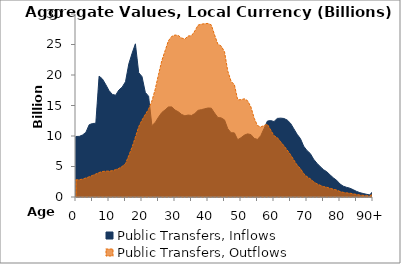
| Category | Public Transfers, Inflows | Public Transfers, Outflows |
|---|---|---|
| 0 | 9920.668 | 2805.339 |
|  | 9938.777 | 2839.822 |
| 2 | 10172.225 | 2936.855 |
| 3 | 10601.365 | 3119.667 |
| 4 | 11849.943 | 3311.089 |
| 5 | 12048.156 | 3537.58 |
| 6 | 12083.906 | 3767.925 |
| 7 | 19814.44 | 4009.179 |
| 8 | 19356.518 | 4180.906 |
| 9 | 18446.782 | 4237.292 |
| 10 | 17447.208 | 4242.71 |
| 11 | 16826.302 | 4310.795 |
| 12 | 16684.255 | 4481.475 |
| 13 | 17539.858 | 4687.702 |
| 14 | 18016.071 | 5019.883 |
| 15 | 18900.366 | 5475.433 |
| 16 | 21809.185 | 6802.804 |
| 17 | 23570.135 | 8172.753 |
| 18 | 25111.389 | 9823.642 |
| 19 | 20380.881 | 11507.075 |
| 20 | 19734.785 | 12611.187 |
| 21 | 17159.165 | 13526.571 |
| 22 | 16506.856 | 14407.683 |
| 23 | 11700.83 | 15741.328 |
| 24 | 12200.439 | 17652.788 |
| 25 | 13087.684 | 20076.02 |
| 26 | 13848.914 | 22343.268 |
| 27 | 14277.727 | 23980.216 |
| 28 | 14761.108 | 25607.101 |
| 29 | 14773.37 | 26327.474 |
| 30 | 14254.788 | 26554.765 |
| 31 | 13971.047 | 26480.08 |
| 32 | 13533.872 | 26057.144 |
| 33 | 13310.927 | 25909.313 |
| 34 | 13435.345 | 26395.416 |
| 35 | 13365.019 | 26444.422 |
| 36 | 13682.045 | 27208.693 |
| 37 | 14206.637 | 28178.239 |
| 38 | 14317.797 | 28339.223 |
| 39 | 14460.916 | 28408.526 |
| 40 | 14588.614 | 28454.356 |
| 41 | 14561.138 | 28212.584 |
| 42 | 13751.503 | 26560.089 |
| 43 | 13022.239 | 25056.15 |
| 44 | 12967.369 | 24748.433 |
| 45 | 12633.656 | 23812.054 |
| 46 | 11181.794 | 20634.886 |
| 47 | 10532.785 | 18965.276 |
| 48 | 10508.145 | 18396.964 |
| 49 | 9391.481 | 15931.026 |
| 50 | 9715.049 | 15954.748 |
| 51 | 10137.777 | 16102.619 |
| 52 | 10351.35 | 15779.111 |
| 53 | 10228.866 | 14776.665 |
| 54 | 9613.046 | 12921.587 |
| 55 | 9434.893 | 11705.814 |
| 56 | 10059.739 | 11483.534 |
| 57 | 11239.312 | 11732.735 |
| 58 | 12453.292 | 11912.003 |
| 59 | 12528.09 | 10978.814 |
| 60 | 12367.384 | 10055.392 |
| 61 | 12876.736 | 9723.511 |
| 62 | 12932.319 | 9059.391 |
| 63 | 12869.881 | 8402.688 |
| 64 | 12617.349 | 7692.604 |
| 65 | 12087.742 | 6957.066 |
| 66 | 11186.541 | 6075.79 |
| 67 | 10284.382 | 5239.975 |
| 68 | 9582.23 | 4659.139 |
| 69 | 8322.684 | 3832.453 |
| 70 | 7610.656 | 3328.099 |
| 71 | 7125.307 | 2981.405 |
| 72 | 6198.212 | 2507.107 |
| 73 | 5541.539 | 2164.002 |
| 74 | 4991.996 | 1919.259 |
| 75 | 4476.863 | 1711.063 |
| 76 | 4138.716 | 1602.515 |
| 77 | 3620.96 | 1424.945 |
| 78 | 3134.708 | 1275.603 |
| 79 | 2731.114 | 1138.52 |
| 80 | 2131.705 | 900.616 |
| 81 | 1773.115 | 758.375 |
| 82 | 1583.537 | 682.687 |
| 83 | 1441.984 | 626.277 |
| 84 | 1194.051 | 525.024 |
| 85 | 923.333 | 413.424 |
| 86 | 718.449 | 329.689 |
| 87 | 572.001 | 270.213 |
| 88 | 448.639 | 218.285 |
| 89 | 341.317 | 171.546 |
| 90+ | 941.71 | 489.509 |